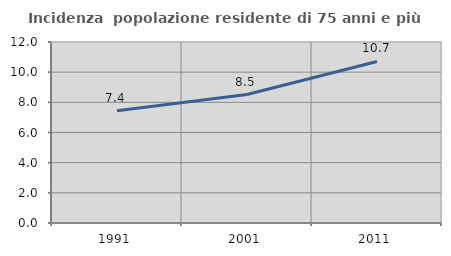
| Category | Incidenza  popolazione residente di 75 anni e più |
|---|---|
| 1991.0 | 7.442 |
| 2001.0 | 8.515 |
| 2011.0 | 10.712 |